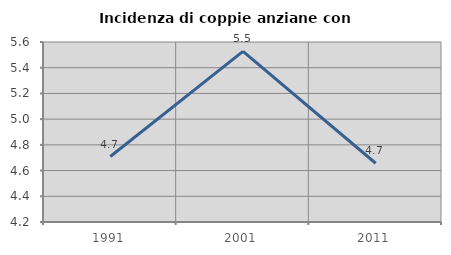
| Category | Incidenza di coppie anziane con figli |
|---|---|
| 1991.0 | 4.709 |
| 2001.0 | 5.528 |
| 2011.0 | 4.657 |